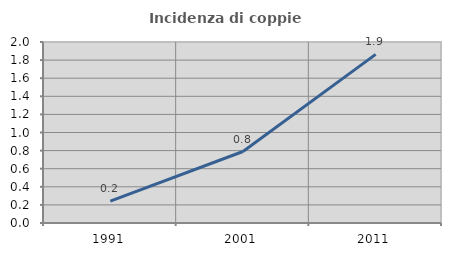
| Category | Incidenza di coppie miste |
|---|---|
| 1991.0 | 0.241 |
| 2001.0 | 0.79 |
| 2011.0 | 1.863 |